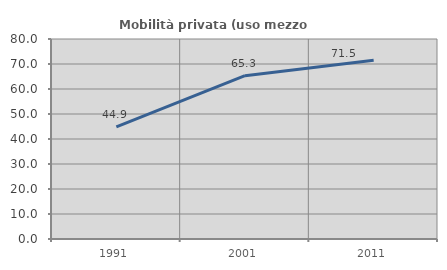
| Category | Mobilità privata (uso mezzo privato) |
|---|---|
| 1991.0 | 44.861 |
| 2001.0 | 65.311 |
| 2011.0 | 71.458 |